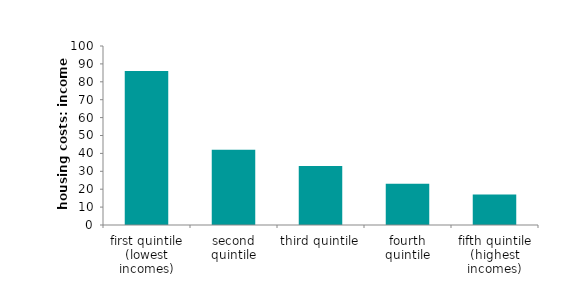
| Category | 2013-14 |
|---|---|
| first quintile (lowest incomes) | 86 |
| second quintile | 42 |
| third quintile | 33 |
| fourth quintile | 23 |
| fifth quintile (highest incomes) | 17 |